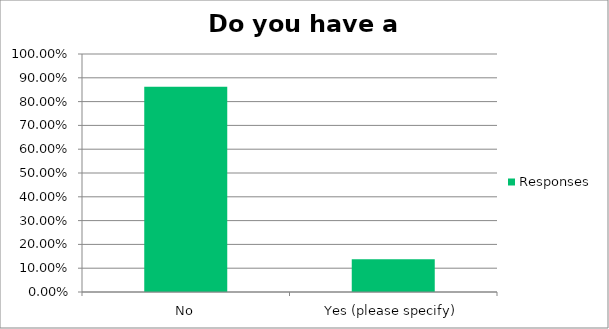
| Category | Responses |
|---|---|
| No | 0.862 |
| Yes (please specify) | 0.138 |